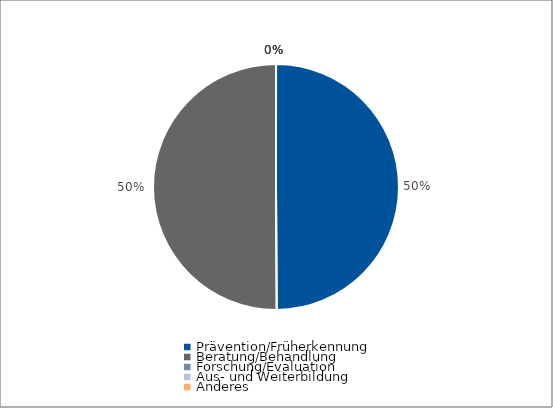
| Category | Series 0 |
|---|---|
| Prävention/Früherkennung | 4324 |
| Beratung/Behandlung | 4340 |
| Forschung/Evaluation | 0 |
| Aus- und Weiterbildung | 0 |
| Anderes | 0 |